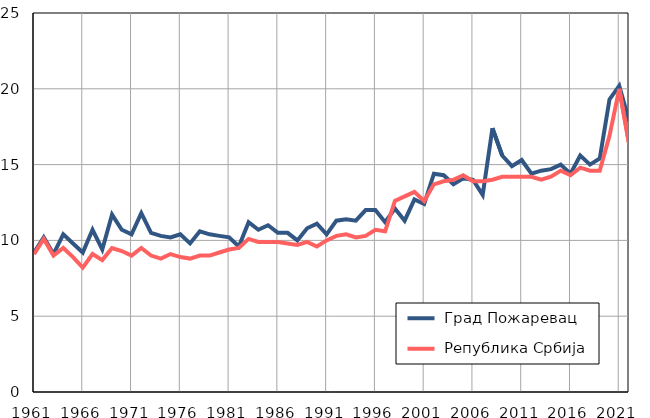
| Category |  Град Пожаревац |  Република Србија |
|---|---|---|
| 1961.0 | 9.2 | 9.1 |
| 1962.0 | 10.2 | 10.1 |
| 1963.0 | 9.1 | 9 |
| 1964.0 | 10.4 | 9.5 |
| 1965.0 | 9.8 | 8.9 |
| 1966.0 | 9.2 | 8.2 |
| 1967.0 | 10.7 | 9.1 |
| 1968.0 | 9.4 | 8.7 |
| 1969.0 | 11.7 | 9.5 |
| 1970.0 | 10.7 | 9.3 |
| 1971.0 | 10.4 | 9 |
| 1972.0 | 11.8 | 9.5 |
| 1973.0 | 10.5 | 9 |
| 1974.0 | 10.3 | 8.8 |
| 1975.0 | 10.2 | 9.1 |
| 1976.0 | 10.4 | 8.9 |
| 1977.0 | 9.8 | 8.8 |
| 1978.0 | 10.6 | 9 |
| 1979.0 | 10.4 | 9 |
| 1980.0 | 10.3 | 9.2 |
| 1981.0 | 10.2 | 9.4 |
| 1982.0 | 9.6 | 9.5 |
| 1983.0 | 11.2 | 10.1 |
| 1984.0 | 10.7 | 9.9 |
| 1985.0 | 11 | 9.9 |
| 1986.0 | 10.5 | 9.9 |
| 1987.0 | 10.5 | 9.8 |
| 1988.0 | 10 | 9.7 |
| 1989.0 | 10.8 | 9.9 |
| 1990.0 | 11.1 | 9.6 |
| 1991.0 | 10.4 | 10 |
| 1992.0 | 11.3 | 10.3 |
| 1993.0 | 11.4 | 10.4 |
| 1994.0 | 11.3 | 10.2 |
| 1995.0 | 12 | 10.3 |
| 1996.0 | 12 | 10.7 |
| 1997.0 | 11.2 | 10.6 |
| 1998.0 | 12.1 | 12.6 |
| 1999.0 | 11.3 | 12.9 |
| 2000.0 | 12.7 | 13.2 |
| 2001.0 | 12.4 | 12.6 |
| 2002.0 | 14.4 | 13.7 |
| 2003.0 | 14.3 | 13.9 |
| 2004.0 | 13.7 | 14 |
| 2005.0 | 14.1 | 14.3 |
| 2006.0 | 14 | 13.9 |
| 2007.0 | 13 | 13.9 |
| 2008.0 | 17.4 | 14 |
| 2009.0 | 15.6 | 14.2 |
| 2010.0 | 14.9 | 14.2 |
| 2011.0 | 15.3 | 14.2 |
| 2012.0 | 14.4 | 14.2 |
| 2013.0 | 14.6 | 14 |
| 2014.0 | 14.7 | 14.2 |
| 2015.0 | 15 | 14.6 |
| 2016.0 | 14.4 | 14.3 |
| 2017.0 | 15.6 | 14.8 |
| 2018.0 | 15 | 14.6 |
| 2019.0 | 15.4 | 14.6 |
| 2020.0 | 19.3 | 16.9 |
| 2021.0 | 20.2 | 20 |
| 2022.0 | 17.9 | 16.4 |